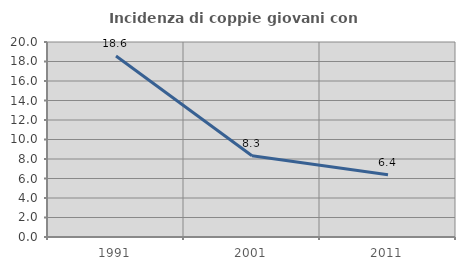
| Category | Incidenza di coppie giovani con figli |
|---|---|
| 1991.0 | 18.571 |
| 2001.0 | 8.333 |
| 2011.0 | 6.383 |